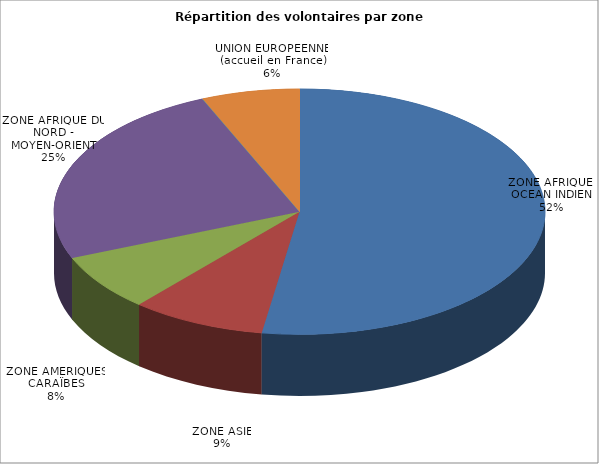
| Category | Nombre de volontaires | % |
|---|---|---|
| ZONE AFRIQUE - OCEAN INDIEN | 609 | 0.525 |
| ZONE ASIE | 103 | 0.089 |
| ZONE AMERIQUES - CARAÏBES | 87 | 0.075 |
| ZONE AFRIQUE DU NORD - MOYEN-ORIENT | 287 | 0.247 |
| EUROPE HORS UE | 0 | 0 |
| UNION EUROPEENNE (accueil en France) | 75 | 0.065 |